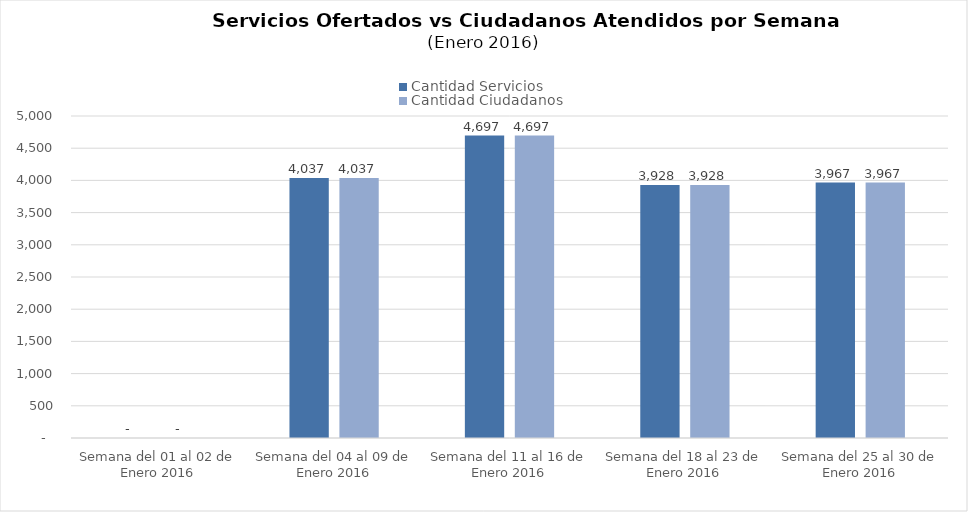
| Category | Cantidad Servicios | Cantidad Ciudadanos |
|---|---|---|
| Semana del 01 al 02 de Enero 2016 | 0 | 0 |
| Semana del 04 al 09 de Enero 2016 | 4037 | 4037 |
| Semana del 11 al 16 de Enero 2016 | 4697 | 4697 |
| Semana del 18 al 23 de Enero 2016 | 3928 | 3928 |
| Semana del 25 al 30 de Enero 2016 | 3967 | 3967 |